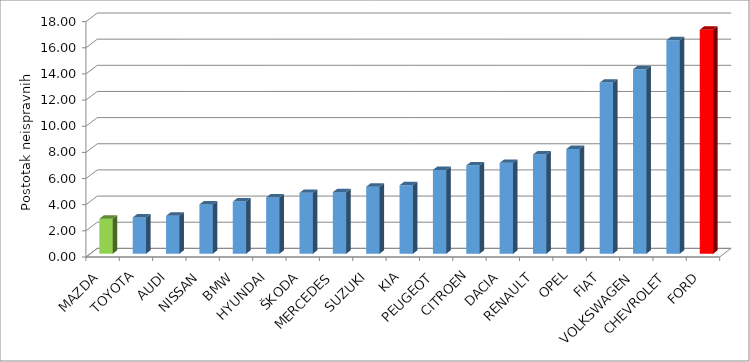
| Category | Series 4 |
|---|---|
| MAZDA | 2.678 |
| TOYOTA | 2.776 |
| AUDI | 2.9 |
| NISSAN | 3.774 |
| BMW | 3.991 |
| HYUNDAI | 4.305 |
| ŠKODA | 4.656 |
| MERCEDES | 4.709 |
| SUZUKI | 5.127 |
| KIA | 5.24 |
| PEUGEOT | 6.412 |
| CITROEN | 6.757 |
| DACIA | 6.949 |
| RENAULT | 7.589 |
| OPEL | 8.01 |
| FIAT | 13.086 |
| VOLKSWAGEN | 14.114 |
| CHEVROLET | 16.328 |
| FORD | 17.134 |